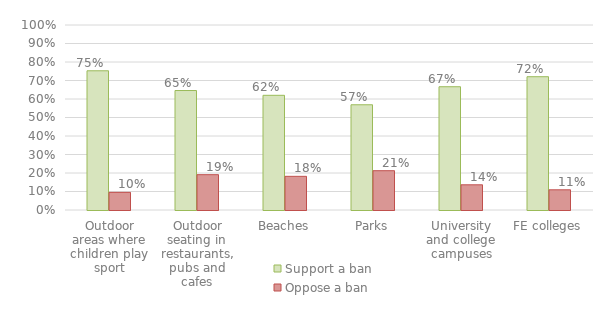
| Category | Support a ban | Oppose a ban |
|---|---|---|
| Outdoor areas where children play sport | 0.752 | 0.095 |
| Outdoor seating in restaurants, pubs and cafes | 0.646 | 0.191 |
| Beaches | 0.62 | 0.182 |
| Parks | 0.569 | 0.212 |
| University and college campuses | 0.666 | 0.136 |
| FE colleges | 0.72 | 0.109 |